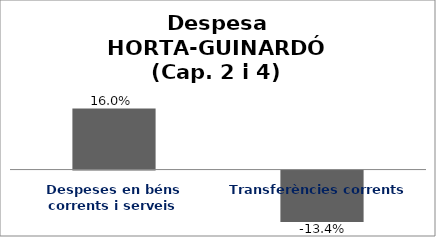
| Category | Series 0 |
|---|---|
| Despeses en béns corrents i serveis | 0.16 |
| Transferències corrents | -0.134 |